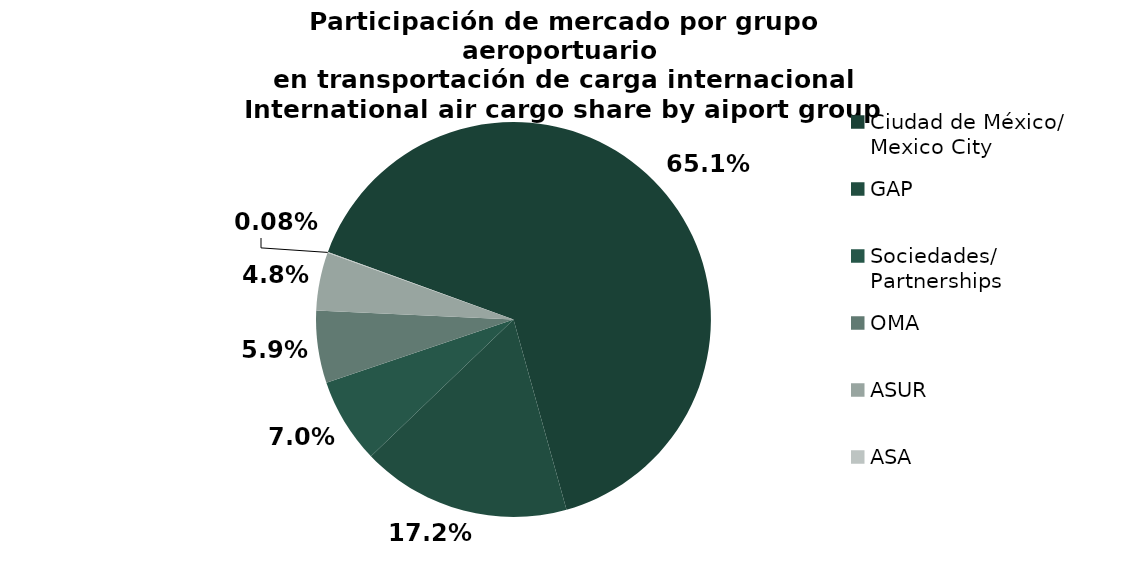
| Category | Series 0 |
|---|---|
| Ciudad de México/
Mexico City | 33985.24 |
| GAP | 8956.42 |
| Sociedades/
Partnerships | 3646.951 |
| OMA | 3081.877 |
| ASUR | 2478.918 |
| ASA | 41.267 |